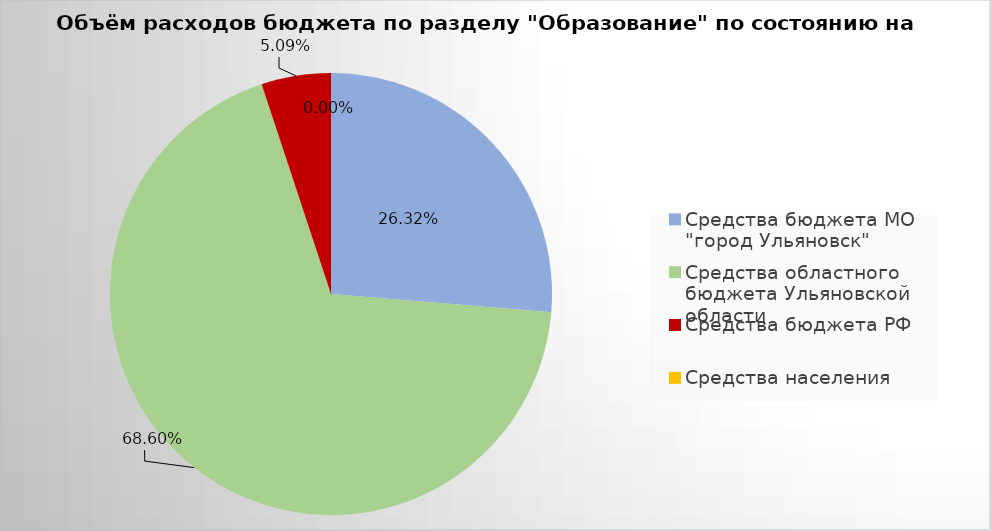
| Category | Series 0 |
|---|---|
| Средства бюджета МО "город Ульяновск" | 2559752.1 |
| Средства областного бюджета Ульяновской области | 6672864.19 |
| Средства бюджета РФ | 494481.61 |
| Средства населения | 0 |